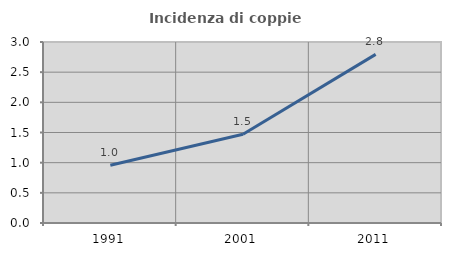
| Category | Incidenza di coppie miste |
|---|---|
| 1991.0 | 0.957 |
| 2001.0 | 1.47 |
| 2011.0 | 2.794 |